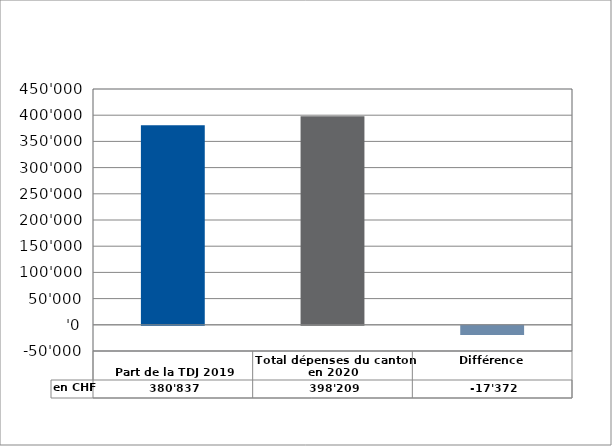
| Category | en CHF |
|---|---|
| 
Part de la TDJ 2019

 | 380837 |
| Total dépenses du canton en 2020 | 398209.07 |
| Différence | -17372.07 |